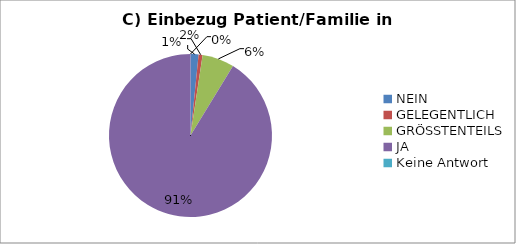
| Category | Series 0 |
|---|---|
| NEIN | 2 |
| GELEGENTLICH | 1 |
| GRÖSSTENTEILS | 8 |
| JA | 115 |
| Keine Antwort | 0 |